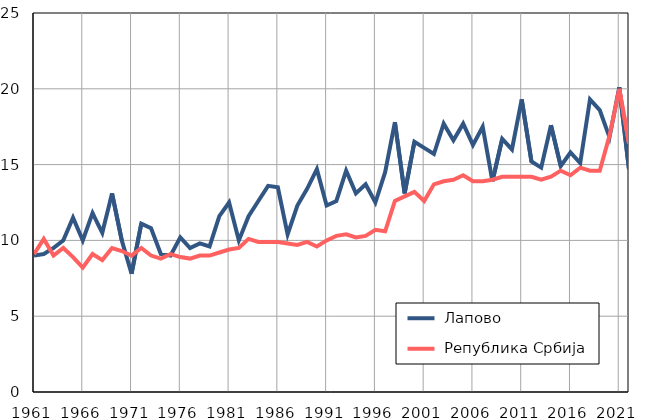
| Category |  Лапово |  Република Србија |
|---|---|---|
| 1961.0 | 9 | 9.1 |
| 1962.0 | 9.1 | 10.1 |
| 1963.0 | 9.5 | 9 |
| 1964.0 | 10 | 9.5 |
| 1965.0 | 11.5 | 8.9 |
| 1966.0 | 10 | 8.2 |
| 1967.0 | 11.8 | 9.1 |
| 1968.0 | 10.5 | 8.7 |
| 1969.0 | 13.1 | 9.5 |
| 1970.0 | 10 | 9.3 |
| 1971.0 | 7.8 | 9 |
| 1972.0 | 11.1 | 9.5 |
| 1973.0 | 10.8 | 9 |
| 1974.0 | 9.1 | 8.8 |
| 1975.0 | 9 | 9.1 |
| 1976.0 | 10.2 | 8.9 |
| 1977.0 | 9.5 | 8.8 |
| 1978.0 | 9.8 | 9 |
| 1979.0 | 9.6 | 9 |
| 1980.0 | 11.6 | 9.2 |
| 1981.0 | 12.5 | 9.4 |
| 1982.0 | 10 | 9.5 |
| 1983.0 | 11.6 | 10.1 |
| 1984.0 | 12.6 | 9.9 |
| 1985.0 | 13.6 | 9.9 |
| 1986.0 | 13.5 | 9.9 |
| 1987.0 | 10.4 | 9.8 |
| 1988.0 | 12.3 | 9.7 |
| 1989.0 | 13.4 | 9.9 |
| 1990.0 | 14.7 | 9.6 |
| 1991.0 | 12.3 | 10 |
| 1992.0 | 12.6 | 10.3 |
| 1993.0 | 14.6 | 10.4 |
| 1994.0 | 13.1 | 10.2 |
| 1995.0 | 13.7 | 10.3 |
| 1996.0 | 12.5 | 10.7 |
| 1997.0 | 14.5 | 10.6 |
| 1998.0 | 17.8 | 12.6 |
| 1999.0 | 13.1 | 12.9 |
| 2000.0 | 16.5 | 13.2 |
| 2001.0 | 16.1 | 12.6 |
| 2002.0 | 15.7 | 13.7 |
| 2003.0 | 17.7 | 13.9 |
| 2004.0 | 16.6 | 14 |
| 2005.0 | 17.7 | 14.3 |
| 2006.0 | 16.3 | 13.9 |
| 2007.0 | 17.5 | 13.9 |
| 2008.0 | 13.9 | 14 |
| 2009.0 | 16.7 | 14.2 |
| 2010.0 | 16 | 14.2 |
| 2011.0 | 19.3 | 14.2 |
| 2012.0 | 15.2 | 14.2 |
| 2013.0 | 14.8 | 14 |
| 2014.0 | 17.6 | 14.2 |
| 2015.0 | 14.9 | 14.6 |
| 2016.0 | 15.8 | 14.3 |
| 2017.0 | 15.1 | 14.8 |
| 2018.0 | 19.3 | 14.6 |
| 2019.0 | 18.6 | 14.6 |
| 2020.0 | 16.8 | 16.9 |
| 2021.0 | 20.1 | 20 |
| 2022.0 | 14.7 | 16.4 |